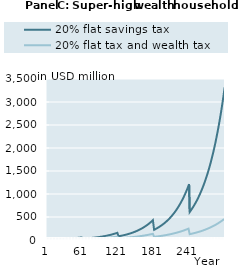
| Category | 20% flat savings tax | 20% flat tax and wealth tax |
|---|---|---|
| 1 | 10000000 | 10000000 |
| 2 | 10314750 | 10244750 |
| 3 | 10638690.7 | 10494933.45 |
| 4 | 10972090.468 | 10750670.973 |
| 5 | 11315225.51 | 11012085.868 |
| 6 | 11668380.095 | 11279304.174 |
| 7 | 12031846.794 | 11552454.727 |
| 8 | 12405926.72 | 11831669.222 |
| 9 | 12790929.78 | 12117082.279 |
| 10 | 13187174.93 | 12408831.505 |
| 11 | 13594990.438 | 12707057.565 |
| 12 | 14014714.159 | 13011904.243 |
| 13 | 14446693.812 | 13323518.517 |
| 14 | 14891287.271 | 13642050.628 |
| 15 | 15348862.86 | 13967654.152 |
| 16 | 15819799.655 | 14300486.074 |
| 17 | 16304487.805 | 14640706.865 |
| 18 | 16803328.849 | 14988480.557 |
| 19 | 17316736.052 | 15343974.826 |
| 20 | 17845134.744 | 15707361.067 |
| 21 | 18388962.679 | 16078814.483 |
| 22 | 18948670.389 | 16458514.164 |
| 23 | 19524721.564 | 16846643.179 |
| 24 | 20117593.434 | 17243388.657 |
| 25 | 20727777.162 | 17648941.885 |
| 26 | 21355778.255 | 18063498.395 |
| 27 | 22002116.981 | 18487258.059 |
| 28 | 22667328.796 | 18920425.188 |
| 29 | 23351964.797 | 19363208.628 |
| 30 | 24056592.169 | 19815821.859 |
| 31 | 24781794.661 | 20278483.104 |
| 32 | 25528173.065 | 20751415.429 |
| 33 | 26296345.718 | 21234846.852 |
| 34 | 27086949.013 | 21729010.452 |
| 35 | 27900637.924 | 22234144.484 |
| 36 | 28738086.552 | 22750492.492 |
| 37 | 29599988.679 | 23278303.425 |
| 38 | 30487058.349 | 23817831.761 |
| 39 | 31400030.452 | 24369337.626 |
| 40 | 32339661.341 | 24933086.921 |
| 41 | 33306729.453 | 25509351.451 |
| 42 | 34290485.953 | 26086859.053 |
| 43 | 35302968.142 | 26677187.324 |
| 44 | 36345014.812 | 27280620.883 |
| 45 | 37417489.245 | 27897450.666 |
| 46 | 38521279.931 | 28527974.071 |
| 47 | 39657301.305 | 29172495.095 |
| 48 | 40826494.503 | 29831324.487 |
| 49 | 42029828.142 | 30504779.89 |
| 50 | 43268299.124 | 31193186.004 |
| 51 | 44542933.458 | 31896874.733 |
| 52 | 45854787.115 | 32616185.352 |
| 53 | 47204946.899 | 33351464.667 |
| 54 | 48594531.349 | 34103067.183 |
| 55 | 50024691.664 | 34871355.274 |
| 56 | 51496612.661 | 35656699.361 |
| 57 | 53011513.75 | 36459478.087 |
| 58 | 54570649.952 | 37280078.5 |
| 59 | 56175312.93 | 38118896.243 |
| 60 | 57826832.068 | 38976335.74 |
| 61 | 28913416.034 | 19488167.87 |
| 62 | 29780437.782 | 19943555.197 |
| 63 | 30672776.565 | 20409052.122 |
| 64 | 31591171.641 | 20884883.079 |
| 65 | 32536383.853 | 21371277.483 |
| 66 | 33509196.262 | 21868469.844 |
| 67 | 34510414.792 | 22376699.874 |
| 68 | 35540868.904 | 22896212.611 |
| 69 | 36601412.276 | 23427258.531 |
| 70 | 37692923.515 | 23970093.671 |
| 71 | 38816306.881 | 24524979.75 |
| 72 | 39972493.042 | 25092184.301 |
| 73 | 41162439.839 | 25671980.792 |
| 74 | 42387133.083 | 26264648.766 |
| 75 | 43647587.369 | 26870473.968 |
| 76 | 44944846.92 | 27489748.49 |
| 77 | 46279986.45 | 28122770.907 |
| 78 | 47654112.054 | 28769846.421 |
| 79 | 49068362.126 | 29431287.011 |
| 80 | 50523908.3 | 30107411.583 |
| 81 | 52021956.423 | 30798546.12 |
| 82 | 53563747.55 | 31505023.844 |
| 83 | 55150558.979 | 32227185.373 |
| 84 | 56783705.301 | 32965378.889 |
| 85 | 58464539.495 | 33719960.3 |
| 86 | 60194454.049 | 34491293.419 |
| 87 | 61974882.107 | 35279750.133 |
| 88 | 63807298.664 | 36085710.586 |
| 89 | 65693221.785 | 36909563.361 |
| 90 | 67634213.862 | 37751705.667 |
| 91 | 69631882.906 | 38612543.533 |
| 92 | 71687883.887 | 39492491.999 |
| 93 | 73803920.097 | 40391975.322 |
| 94 | 75981744.564 | 41311427.174 |
| 95 | 78223161.505 | 42251290.857 |
| 96 | 80530027.821 | 43212019.514 |
| 97 | 82904254.633 | 44194076.348 |
| 98 | 85347808.868 | 45197934.842 |
| 99 | 87862714.887 | 46224078.996 |
| 100 | 90451056.162 | 47273003.55 |
| 101 | 93114977.002 | 48345214.228 |
| 102 | 95845134.331 | 49429677.984 |
| 103 | 98655012.253 | 50538216.836 |
| 104 | 101546938.611 | 51671365.249 |
| 105 | 104523309.218 | 52829669.558 |
| 106 | 107586589.847 | 54013688.222 |
| 107 | 110739318.271 | 55223992.101 |
| 108 | 113984106.364 | 56461164.725 |
| 109 | 117323642.27 | 57725802.582 |
| 110 | 120760692.625 | 59018515.399 |
| 111 | 124298104.849 | 60339926.441 |
| 112 | 127938809.511 | 61690672.808 |
| 113 | 131685822.748 | 63071405.745 |
| 114 | 135542248.773 | 64482790.952 |
| 115 | 139511282.437 | 65925508.911 |
| 116 | 143596211.884 | 67400255.209 |
| 117 | 147800421.271 | 68907740.875 |
| 118 | 152127393.572 | 70448692.722 |
| 119 | 156580713.464 | 72023853.701 |
| 120 | 161164070.298 | 73633983.253 |
| 121 | 80582035.149 | 36816991.626 |
| 122 | 82957780.575 | 37657078.84 |
| 123 | 85402897.768 | 38515815.991 |
| 124 | 87919412.383 | 39393617.106 |
| 125 | 90509409.224 | 40290905.405 |
| 126 | 93175033.974 | 41208113.505 |
| 127 | 95918494.966 | 42145683.625 |
| 128 | 98742065.019 | 43104067.802 |
| 129 | 101648083.317 | 44083728.107 |
| 130 | 104638957.35 | 45085136.871 |
| 131 | 107717164.905 | 46108776.91 |
| 132 | 110885256.12 | 47155141.757 |
| 133 | 114145855.599 | 48224735.904 |
| 134 | 117501664.582 | 49318075.041 |
| 135 | 120955463.188 | 50435686.307 |
| 136 | 124510112.713 | 51578108.543 |
| 137 | 128168558.004 | 52745892.553 |
| 138 | 131933829.898 | 53939601.367 |
| 139 | 135809047.731 | 55159810.518 |
| 140 | 139797421.925 | 56407108.311 |
| 141 | 143902256.645 | 57682096.116 |
| 142 | 148126952.539 | 58985388.649 |
| 143 | 152475009.553 | 60317614.277 |
| 144 | 156950029.832 | 61679415.314 |
| 145 | 161555720.703 | 63071448.334 |
| 146 | 166295897.748 | 64494384.487 |
| 147 | 171174487.962 | 65948909.823 |
| 148 | 176195533.011 | 67435725.621 |
| 149 | 181363192.574 | 68955548.73 |
| 150 | 186681747.798 | 70509111.912 |
| 151 | 192155604.833 | 72097164.196 |
| 152 | 197789298.494 | 73720471.241 |
| 153 | 203587496.01 | 75379815.703 |
| 154 | 209555000.894 | 77075997.611 |
| 155 | 215696756.92 | 78809834.758 |
| 156 | 222017852.222 | 80582163.09 |
| 157 | 228523523.507 | 82393837.111 |
| 158 | 235219160.393 | 84245730.294 |
| 159 | 242110309.877 | 86138735.507 |
| 160 | 249202680.925 | 88073765.435 |
| 161 | 256502149.208 | 90051753.028 |
| 162 | 264003211.965 | 92062101.945 |
| 163 | 271723305.755 | 94117080.608 |
| 164 | 279668826.283 | 96217679.798 |
| 165 | 287846356.01 | 98364912.289 |
| 166 | 296262669.606 | 100559813.342 |
| 167 | 304924739.558 | 102803441.198 |
| 168 | 313839741.953 | 105096877.593 |
| 169 | 323015062.418 | 107441228.275 |
| 170 | 332458302.241 | 109837623.543 |
| 171 | 342177284.666 | 112287218.786 |
| 172 | 352180061.378 | 114791195.043 |
| 173 | 362474919.171 | 117350759.573 |
| 174 | 373070386.811 | 119967146.435 |
| 175 | 383975242.105 | 122641617.086 |
| 176 | 395198519.175 | 125375460.985 |
| 177 | 406749515.935 | 128169996.219 |
| 178 | 418637801.8 | 131026570.135 |
| 179 | 430873225.613 | 133946559.992 |
| 180 | 443465923.8 | 136931373.624 |
| 181 | 221732961.9 | 68465686.812 |
| 182 | 228230314.388 | 70008375.059 |
| 183 | 234917389.568 | 71585310.986 |
| 184 | 241799727.343 | 73197254.89 |
| 185 | 248883029.382 | 74844983.948 |
| 186 | 256173163.84 | 76529292.592 |
| 187 | 263676170.224 | 78250992.887 |
| 188 | 271398264.394 | 80010914.929 |
| 189 | 279345843.715 | 81809907.241 |
| 190 | 287525492.351 | 83648837.182 |
| 191 | 295943986.728 | 85528591.367 |
| 192 | 304608301.14 | 87450076.095 |
| 193 | 313525613.533 | 89414217.785 |
| 194 | 322703311.449 | 91421963.419 |
| 195 | 332148998.143 | 93474281.007 |
| 196 | 341870498.889 | 95572160.046 |
| 197 | 351875867.456 | 97716611.999 |
| 198 | 362173392.786 | 99908670.785 |
| 199 | 372771605.855 | 102149393.277 |
| 200 | 383679286.746 | 104439859.807 |
| 201 | 394905471.919 | 106781174.695 |
| 202 | 406459461.699 | 109174466.773 |
| 203 | 418350827.981 | 111620889.936 |
| 204 | 430589422.158 | 114121623.692 |
| 205 | 443185383.285 | 116677873.738 |
| 206 | 456149146.477 | 119290872.535 |
| 207 | 469491451.554 | 121961879.905 |
| 208 | 483223351.939 | 124692183.639 |
| 209 | 497356223.816 | 127483100.116 |
| 210 | 511901775.551 | 130335974.939 |
| 211 | 526872057.398 | 133252183.582 |
| 212 | 542279471.474 | 136233132.058 |
| 213 | 558136782.041 | 139280257.59 |
| 214 | 574457126.076 | 142395029.308 |
| 215 | 591254024.158 | 145578948.959 |
| 216 | 608541391.663 | 148833551.626 |
| 217 | 626333550.3 | 152160406.472 |
| 218 | 644645239.968 | 155561117.495 |
| 219 | 663491630.975 | 159037324.304 |
| 220 | 682888336.6 | 162590702.903 |
| 221 | 702851426.029 | 166222966.508 |
| 222 | 723385887.669 | 169924316.364 |
| 223 | 744519955.589 | 173707836.187 |
| 224 | 766271138.292 | 177575350.151 |
| 225 | 788657455.53 | 181528722.924 |
| 226 | 811697453.231 | 185569860.573 |
| 227 | 835410218.866 | 189700711.478 |
| 228 | 859815397.257 | 193923267.273 |
| 229 | 884933206.856 | 198239563.806 |
| 230 | 910784456.497 | 202651682.123 |
| 231 | 937390562.626 | 207161749.466 |
| 232 | 964773567.055 | 211771940.304 |
| 233 | 992956155.213 | 216484477.379 |
| 234 | 1021961674.945 | 221301632.776 |
| 235 | 1051814155.854 | 226225729.024 |
| 236 | 1082538329.205 | 231259140.208 |
| 237 | 1114159648.417 | 236404293.121 |
| 238 | 1146704310.151 | 241663668.428 |
| 239 | 1180199276.008 | 247039801.867 |
| 240 | 1214672294.867 | 252535285.469 |
| 241 | 607336147.433 | 126267642.734 |
| 242 | 625093112.939 | 129093534.403 |
| 243 | 643368581.836 | 131982160.867 |
| 244 | 662177694.426 | 134934914.838 |
| 245 | 681536033.103 | 137953219.948 |
| 246 | 701459635.27 | 141038531.43 |
| 247 | 721965006.62 | 144192336.828 |
| 248 | 743069134.813 | 147416156.706 |
| 249 | 764789503.55 | 150711545.385 |
| 250 | 787144107.053 | 154080091.692 |
| 251 | 810151464.979 | 157523419.728 |
| 252 | 833830637.757 | 161043189.646 |
| 253 | 858201242.379 | 164641098.456 |
| 254 | 883283468.656 | 168318880.841 |
| 255 | 909098095.941 | 172078309.996 |
| 256 | 935666510.343 | 175921198.478 |
| 257 | 963010722.445 | 179849399.084 |
| 258 | 991153385.54 | 183864805.744 |
| 259 | 1020117814.398 | 187969354.431 |
| 260 | 1049928004.578 | 192165024.1 |
| 261 | 1080608652.312 | 196453837.635 |
| 262 | 1112185174.96 | 200837862.83 |
| 263 | 1144683732.068 | 205319213.385 |
| 264 | 1178131247.045 | 209900049.922 |
| 265 | 1212555429.458 | 214582581.031 |
| 266 | 1247984797.999 | 219369064.329 |
| 267 | 1284448704.1 | 224261807.558 |
| 268 | 1321977356.26 | 229263169.685 |
| 269 | 1360601845.063 | 234375562.052 |
| 270 | 1400354168.939 | 239601449.53 |
| 271 | 1441267260.672 | 244943351.71 |
| 272 | 1483375014.683 | 250403844.117 |
| 273 | 1526712315.112 | 255985559.457 |
| 274 | 1571315064.713 | 261691188.877 |
| 275 | 1617220214.603 | 267523483.27 |
| 276 | 1664465794.869 | 273485254.598 |
| 277 | 1713090946.079 | 279579377.251 |
| 278 | 1763135951.705 | 285808789.426 |
| 279 | 1814642271.495 | 292176494.551 |
| 280 | 1867652575.822 | 298685562.73 |
| 281 | 1922210781.036 | 305339132.222 |
| 282 | 1978350535.843 | 312128860.958 |
| 283 | 2036129571.489 | 319069321.671 |
| 284 | 2095595754.977 | 326163860.612 |
| 285 | 2156798351.022 | 333415898.318 |
| 286 | 2219788062.872 | 340828931.26 |
| 287 | 2284617074.308 | 348406533.534 |
| 288 | 2351339092.878 | 356152358.579 |
| 289 | 2420009394.39 | 364070140.939 |
| 290 | 2490684868.706 | 372163698.068 |
| 291 | 2563424066.872 | 380436932.165 |
| 292 | 2638287249.625 | 388893832.059 |
| 293 | 2715336437.314 | 397538475.131 |
| 294 | 2794635461.283 | 406375029.279 |
| 295 | 2876250016.753 | 415407754.929 |
| 296 | 2960247717.242 | 424641007.088 |
| 297 | 3046698150.585 | 434079237.446 |
| 298 | 3135672936.582 | 443726996.517 |
| 299 | 3227245786.331 | 453588935.84 |
| 300 | 3321492563.291 | 463669810.215 |